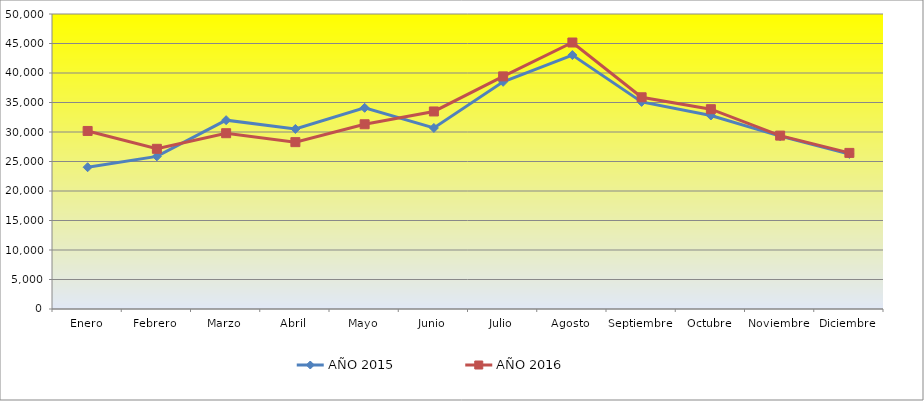
| Category | AÑO 2015 | AÑO 2016 |
|---|---|---|
| Enero | 24029 | 30176 |
| Febrero | 25871 | 27150 |
| Marzo | 32007 | 29795 |
| Abril | 30514 | 28280 |
| Mayo | 34097 | 31311 |
| Junio | 30685 | 33481 |
| Julio | 38506 | 39426 |
| Agosto | 43038 | 45168 |
| Septiembre | 35102 | 35886 |
| Octubre | 32794 | 33866 |
| Noviembre | 29295 | 29390 |
| Diciembre | 26282 | 26458 |